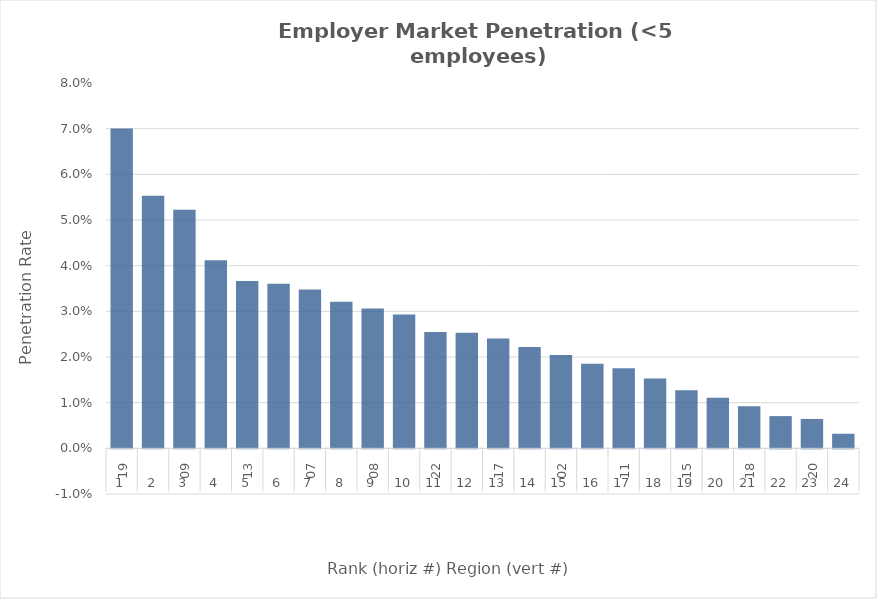
| Category | Rate |
|---|---|
| 0 | 0.07 |
| 1 | 0.055 |
| 2 | 0.052 |
| 3 | 0.041 |
| 4 | 0.037 |
| 5 | 0.036 |
| 6 | 0.035 |
| 7 | 0.032 |
| 8 | 0.031 |
| 9 | 0.029 |
| 10 | 0.025 |
| 11 | 0.025 |
| 12 | 0.024 |
| 13 | 0.022 |
| 14 | 0.02 |
| 15 | 0.019 |
| 16 | 0.018 |
| 17 | 0.015 |
| 18 | 0.013 |
| 19 | 0.011 |
| 20 | 0.009 |
| 21 | 0.007 |
| 22 | 0.006 |
| 23 | 0.003 |